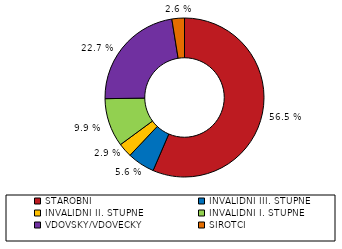
| Category | Series 0 |
|---|---|
| STAROBNÍ | 91469 |
| INVALIDNÍ III. STUPNĚ | 9019 |
| INVALIDNÍ II. STUPNĚ | 4657 |
| INVALIDNÍ I. STUPNĚ | 15973 |
| VDOVSKÝ/VDOVECKÝ | 36738 |
| SIROTČÍ | 4136 |